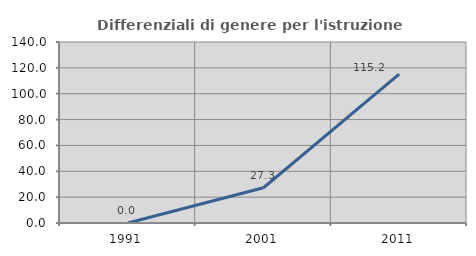
| Category | Differenziali di genere per l'istruzione superiore |
|---|---|
| 1991.0 | 0 |
| 2001.0 | 27.273 |
| 2011.0 | 115.226 |